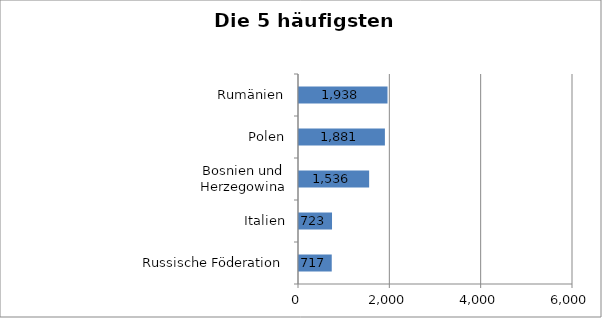
| Category | Series 0 |
|---|---|
| Russische Föderation | 717 |
| Italien | 723 |
| Bosnien und Herzegowina | 1536 |
| Polen | 1881 |
| Rumänien | 1938 |